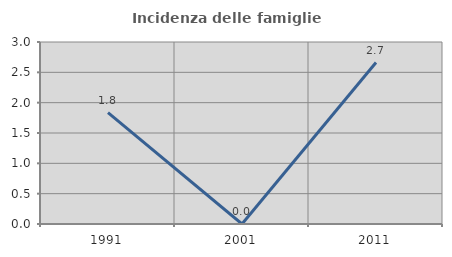
| Category | Incidenza delle famiglie numerose |
|---|---|
| 1991.0 | 1.835 |
| 2001.0 | 0 |
| 2011.0 | 2.662 |